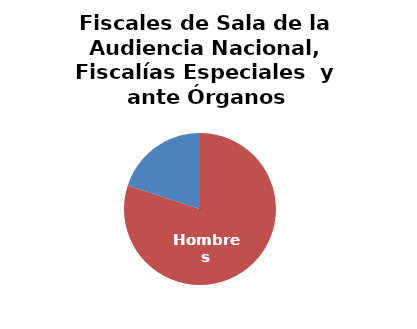
| Category | Fiscales de Sala de la Audiencia Nacional, Fiscalías Especiales  y ante Órganos Constitucionales |
|---|---|
| Hombres | 4 |
| Mujeres | 1 |